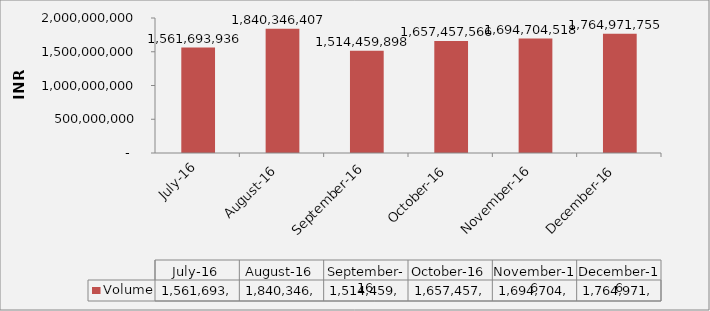
| Category | Volume |
|---|---|
| 2016-07-01 | 1561693936 |
| 2016-08-01 | 1840346407 |
| 2016-09-01 | 1514459898 |
| 2016-10-01 | 1657457566 |
| 2016-11-01 | 1694704518 |
| 2016-12-01 | 1764971755 |